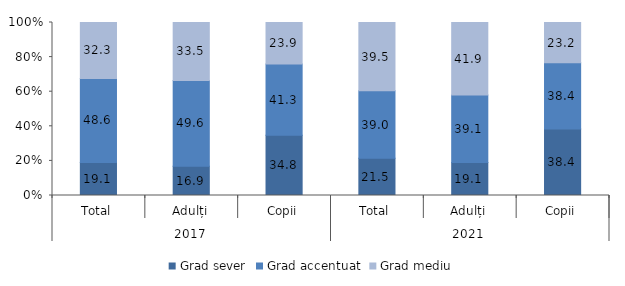
| Category | Grad sever | Grad accentuat | Grad mediu |
|---|---|---|---|
| 0 | 19.1 | 48.57 | 32.34 |
| 1 | 16.9 | 49.6 | 33.5 |
| 2 | 34.8 | 41.28 | 23.92 |
| 3 | 21.54 | 38.96 | 39.48 |
| 4 | 19.06 | 39.05 | 41.87 |
| 5 | 38.4 | 38.36 | 23.2 |